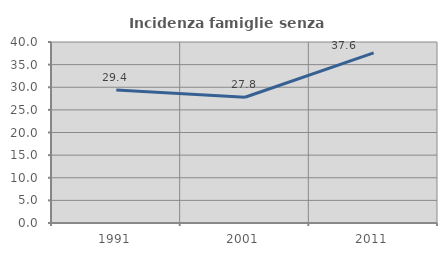
| Category | Incidenza famiglie senza nuclei |
|---|---|
| 1991.0 | 29.368 |
| 2001.0 | 27.798 |
| 2011.0 | 37.589 |